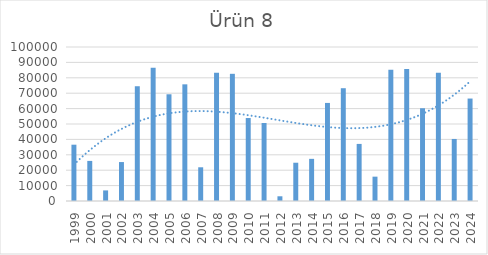
| Category | Ürün 8 |
|---|---|
| 1999.0 | 36561 |
| 2000.0 | 26028 |
| 2001.0 | 6879 |
| 2002.0 | 25289 |
| 2003.0 | 74521 |
| 2004.0 | 86589 |
| 2005.0 | 69302 |
| 2006.0 | 75760 |
| 2007.0 | 21893 |
| 2008.0 | 83253 |
| 2009.0 | 82588 |
| 2010.0 | 53875 |
| 2011.0 | 50660 |
| 2012.0 | 3061 |
| 2013.0 | 24852 |
| 2014.0 | 27371 |
| 2015.0 | 63680 |
| 2016.0 | 73240 |
| 2017.0 | 37068 |
| 2018.0 | 15804 |
| 2019.0 | 85271 |
| 2020.0 | 85675 |
| 2021.0 | 60235 |
| 2022.0 | 83199 |
| 2023.0 | 40283 |
| 2024.0 | 66529 |